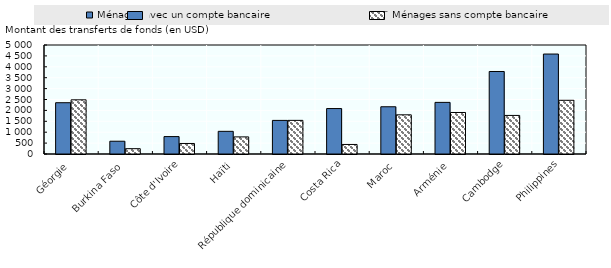
| Category | Ménages avec un compte bancaire | Ménages sans compte bancaire |
|---|---|---|
| Géorgie | 2352.519 | 2485.168 |
| Burkina Faso | 586.124 | 244.262 |
| Côte d'Ivoire | 799 | 483 |
| Haïti | 1039.783 | 784.699 |
| République dominicaine | 1541.172 | 1542.791 |
| Costa Rica | 2084.637 | 437.5 |
| Maroc | 2167 | 1797 |
| Arménie | 2367.551 | 1903.844 |
| Cambodge | 3784.645 | 1769.484 |
| Philippines | 4585.686 | 2463.711 |